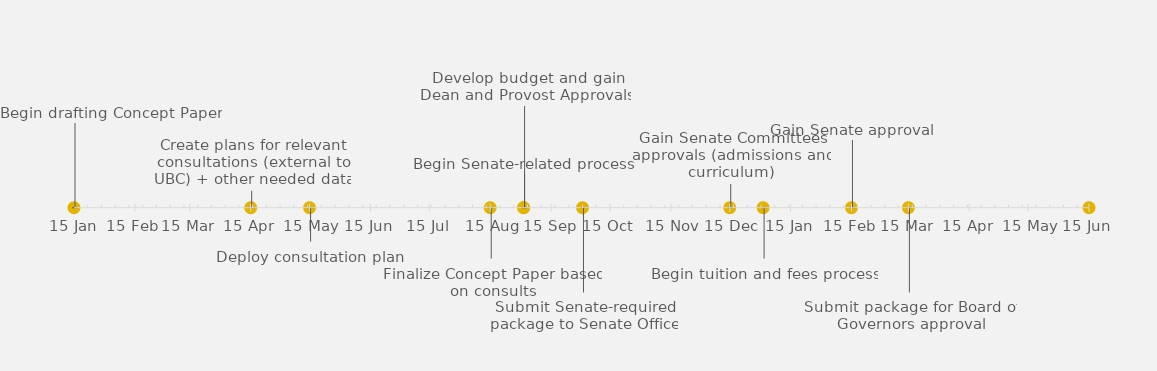
| Category | POSITION |
|---|---|
| Begin drafting Concept Paper | 25 |
| Create plans for relevant consultations (external to UBC) + other needed data | 5 |
| Deploy consultation plan | -10 |
| Finalize Concept Paper based on consults | -15 |
| Develop budget and gain Dean and Provost Approvals | 30 |
| Begin Senate-related process | 10 |
| Submit Senate-required package to Senate Office | -25 |
| Gain Senate Committees approvals (admissions and curriculum) | 7 |
| Begin tuition and fees process  | -15 |
| Gain Senate approval | 20 |
| Submit package for Board of Governors approval | -25 |
| Submit package for Ministry approval | 10 |